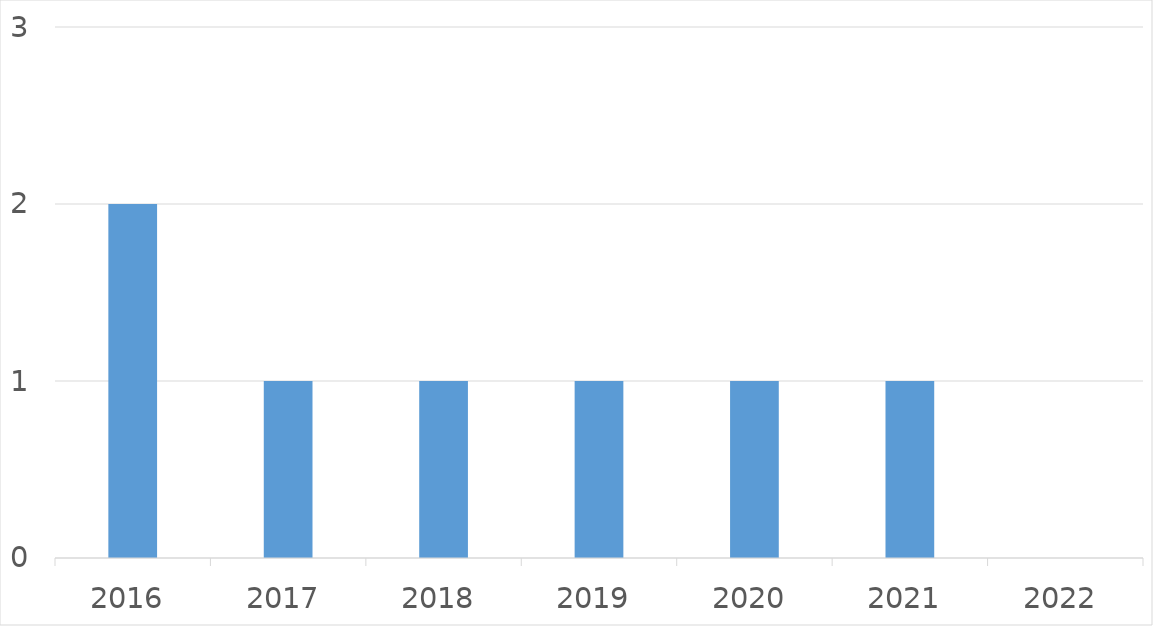
| Category | Series 0 |
|---|---|
| 2016 | 2 |
| 2017 | 1 |
| 2018 | 1 |
| 2019 | 1 |
| 2020 | 1 |
| 2021 | 1 |
| 2022 | 0 |